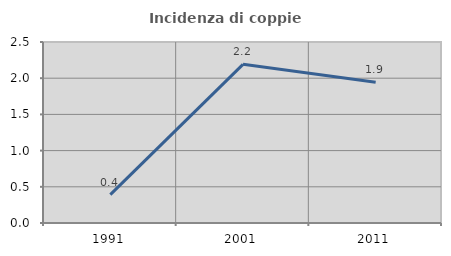
| Category | Incidenza di coppie miste |
|---|---|
| 1991.0 | 0.391 |
| 2001.0 | 2.191 |
| 2011.0 | 1.944 |